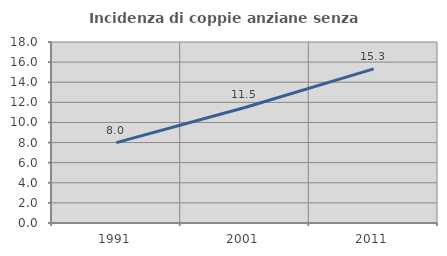
| Category | Incidenza di coppie anziane senza figli  |
|---|---|
| 1991.0 | 7.998 |
| 2001.0 | 11.488 |
| 2011.0 | 15.325 |